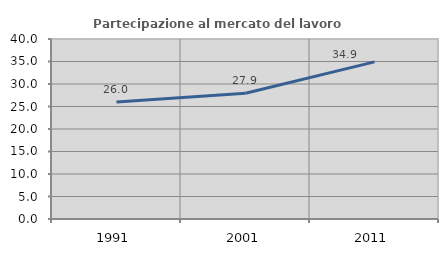
| Category | Partecipazione al mercato del lavoro  femminile |
|---|---|
| 1991.0 | 26.014 |
| 2001.0 | 27.931 |
| 2011.0 | 34.921 |